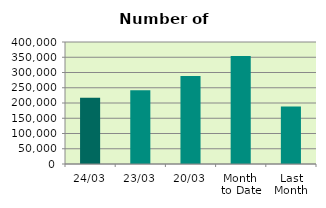
| Category | Series 0 |
|---|---|
| 24/03 | 216880 |
| 23/03 | 242096 |
| 20/03 | 288436 |
| Month 
to Date | 354485.412 |
| Last
Month | 188783.7 |